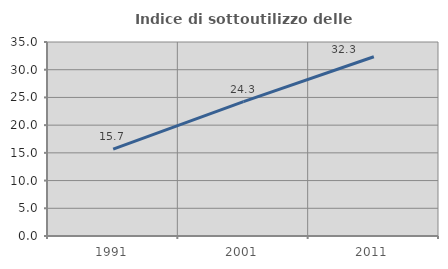
| Category | Indice di sottoutilizzo delle abitazioni  |
|---|---|
| 1991.0 | 15.67 |
| 2001.0 | 24.252 |
| 2011.0 | 32.333 |